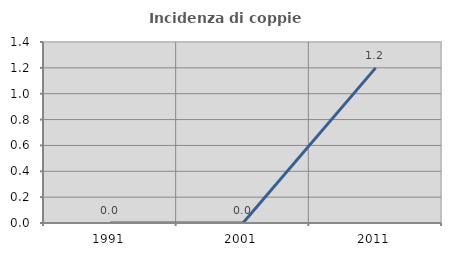
| Category | Incidenza di coppie miste |
|---|---|
| 1991.0 | 0 |
| 2001.0 | 0 |
| 2011.0 | 1.2 |